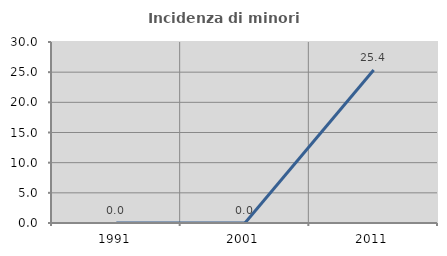
| Category | Incidenza di minori stranieri |
|---|---|
| 1991.0 | 0 |
| 2001.0 | 0 |
| 2011.0 | 25.373 |